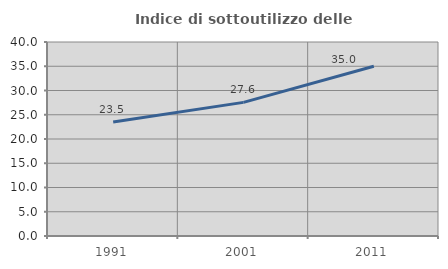
| Category | Indice di sottoutilizzo delle abitazioni  |
|---|---|
| 1991.0 | 23.521 |
| 2001.0 | 27.552 |
| 2011.0 | 35.013 |